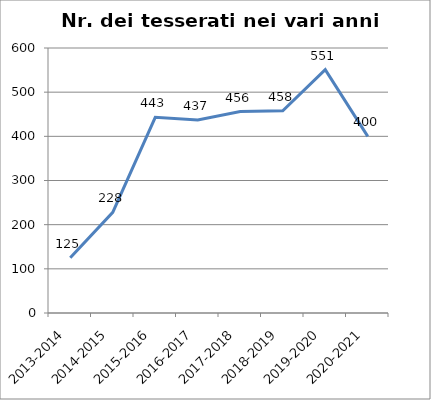
| Category | Nr. Tesserati |
|---|---|
| 2013-2014 | 125 |
| 2014-2015 | 228 |
| 2015-2016 | 443 |
| 2016-2017 | 437 |
| 2017-2018 | 456 |
| 2018-2019 | 458 |
| 2019-2020 | 551 |
| 2020-2021 | 400 |